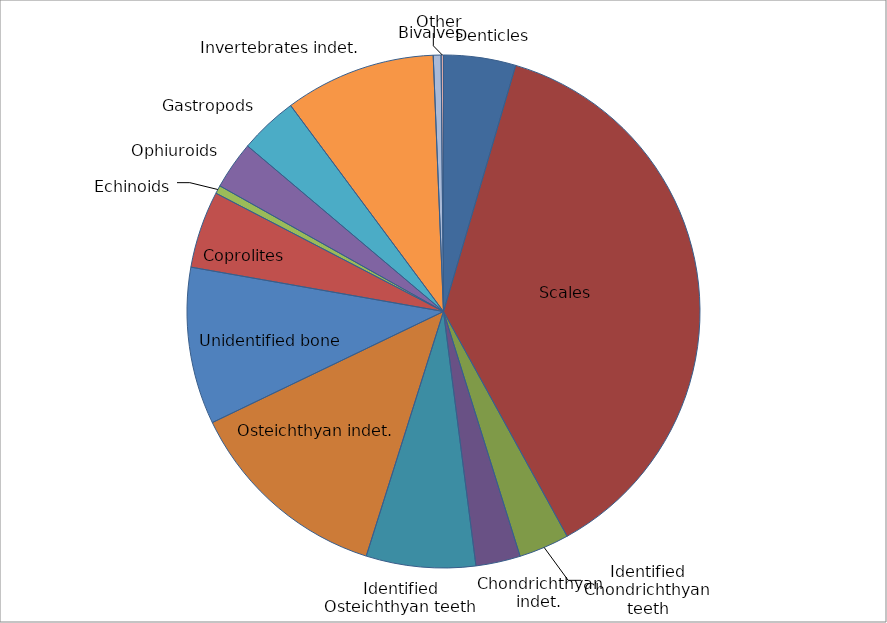
| Category | Series 0 |
|---|---|
| Denticles  | 887 |
| Scales | 7311 |
| Identified Chondrichthyan teeth | 620 |
| Unidentified Chondrichthyan fossils | 548 |
| Identified Osteichthyan teeth | 1345 |
| Unidentified Osteichthyan fossils | 2538 |
| Unidentified bone | 1932 |
| Coprolites | 949 |
| Echinoids | 101 |
| Ophiuroids | 589 |
| Gastropods | 717 |
| Unidentified Invertebrates | 1859 |
| Bivalves | 96 |
| Other | 29 |